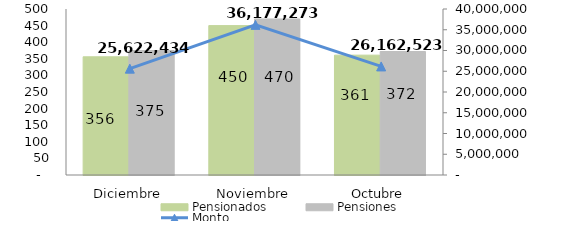
| Category | Pensionados | Pensiones |
|---|---|---|
| Diciembre | 356 | 375 |
| Noviembre | 450 | 470 |
| Octubre | 361 | 372 |